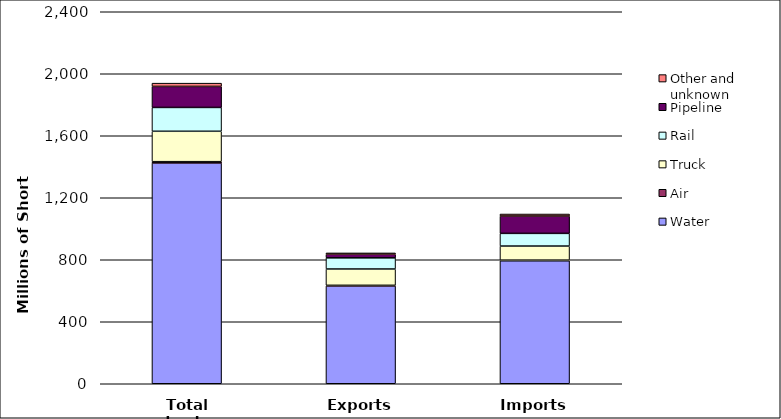
| Category | Water | Air | Truck | Rail | Pipeline | Other and unknown |
|---|---|---|---|---|---|---|
| Total trade | 1424.78 | 7.884 | 196.218 | 153.795 | 135.588 | 21.087 |
| Exports | 631.305 | 3.7 | 105.338 | 71.975 | 23.728 | 8.013 |
| Imports | 793.408 | 4.1 | 90.88 | 81.82 | 111.86 | 13.074 |